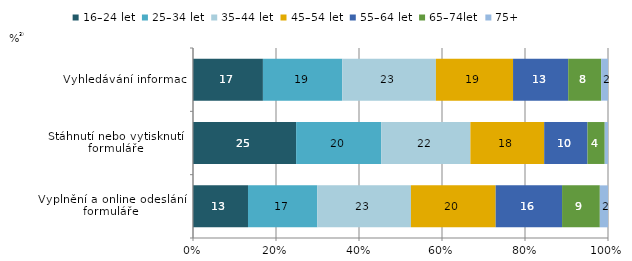
| Category | 16–24 let | 25–34 let | 35–44 let | 45–54 let | 55–64 let | 65–74let | 75+ |
|---|---|---|---|---|---|---|---|
| Vyplnění a online odeslání 
formuláře | 13.253 | 16.701 | 22.566 | 20.41 | 16 | 9.1 | 1.97 |
| Stáhnutí nebo vytisknutí 
formuláře | 24.851 | 20.498 | 21.504 | 17.781 | 10.44 | 4.155 | 0.786 |
| Vyhledávání informací | 16.848 | 19.114 | 22.576 | 18.585 | 13.292 | 7.938 | 1.652 |